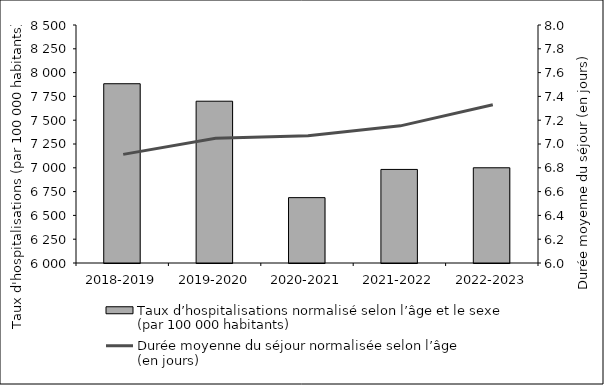
| Category | Taux d’hospitalisations normalisé selon l’âge et le sexe 
(par 100 000 habitants) |
|---|---|
| 2018-2019 | 7883.11 |
| 2019-2020 | 7699.481 |
| 2020-2021 | 6686.675 |
| 2021-2022 | 6982.958 |
| 2022-2023 | 7000.253 |